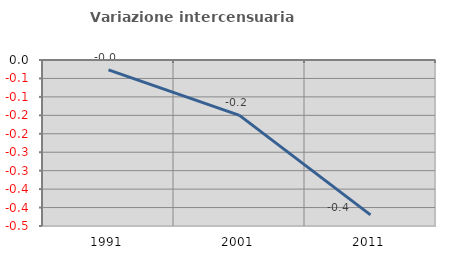
| Category | Variazione intercensuaria annua |
|---|---|
| 1991.0 | -0.027 |
| 2001.0 | -0.15 |
| 2011.0 | -0.42 |